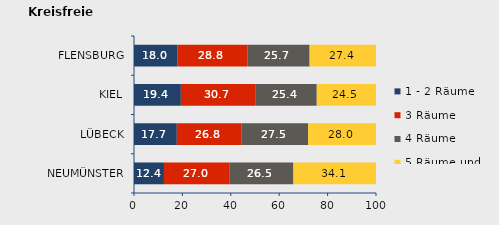
| Category | 1 - 2 Räume | 3 Räume | 4 Räume | 5 Räume und mehr |
|---|---|---|---|---|
| NEUMÜNSTER | 12.379 | 26.983 | 26.523 | 34.116 |
| LÜBECK | 17.685 | 26.822 | 27.454 | 28.039 |
| KIEL | 19.37 | 30.718 | 25.44 | 24.473 |
| FLENSBURG | 18.035 | 28.798 | 25.736 | 27.431 |